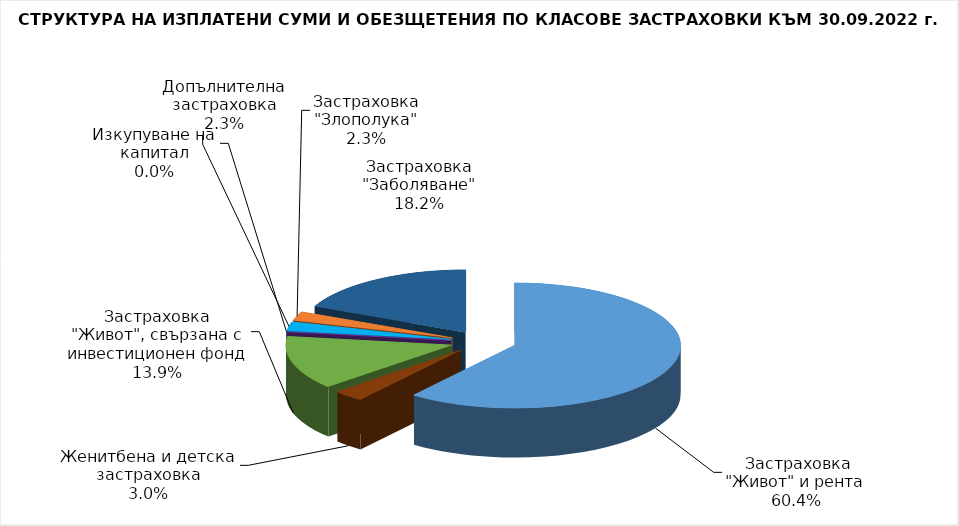
| Category |  Застраховка "Живот" и рента |
|---|---|
|  Застраховка "Живот" и рента | 115907118.584 |
| Женитбена и детска застраховка | 5737578.926 |
| Застраховка "Живот", свързана с инвестиционен фонд | 26595850.409 |
| Изкупуване на капитал | 0 |
| Допълнителна застраховка | 4457054.985 |
| Застраховка "Злополука" | 4427373.484 |
| Застраховка "Заболяване" | 34876998.281 |